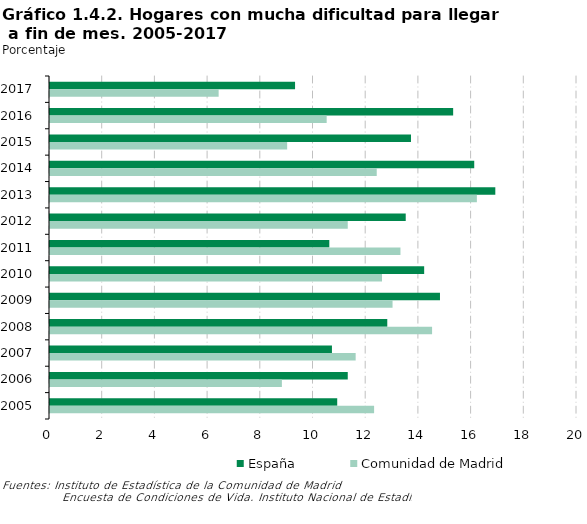
| Category | España | Comunidad de Madrid |
|---|---|---|
| 2017 | 9.3 | 6.4 |
| 2016 | 15.3 | 10.5 |
| 2015 | 13.7 | 9 |
| 2014 | 16.1 | 12.4 |
| 2013 | 16.9 | 16.2 |
| 2012 | 13.5 | 11.3 |
| 2011 | 10.6 | 13.3 |
| 2010 | 14.2 | 12.6 |
| 2009 | 14.8 | 13 |
| 2008 | 12.8 | 14.5 |
| 2007 | 10.7 | 11.6 |
| 2006 | 11.3 | 8.8 |
| 2005 | 10.9 | 12.3 |